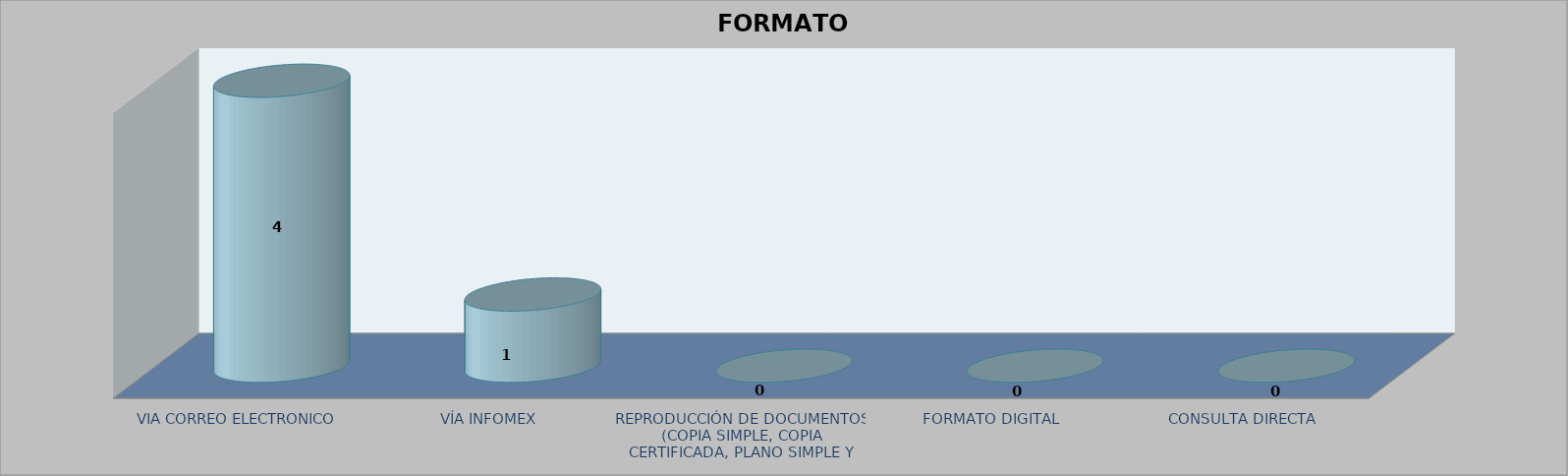
| Category |        FORMATO SOLICITADO | Series 1 | Series 2 |
|---|---|---|---|
| VIA CORREO ELECTRONICO |  |  | 4 |
| VÍA INFOMEX |  |  | 1 |
| REPRODUCCIÓN DE DOCUMENTOS (COPIA SIMPLE, COPIA CERTIFICADA, PLANO SIMPLE Y PLANO CERTIFICADO) |  |  | 0 |
| FORMATO DIGITAL |  |  | 0 |
| CONSULTA DIRECTA |  |  | 0 |